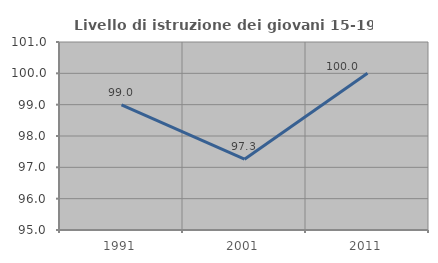
| Category | Livello di istruzione dei giovani 15-19 anni |
|---|---|
| 1991.0 | 98.99 |
| 2001.0 | 97.26 |
| 2011.0 | 100 |